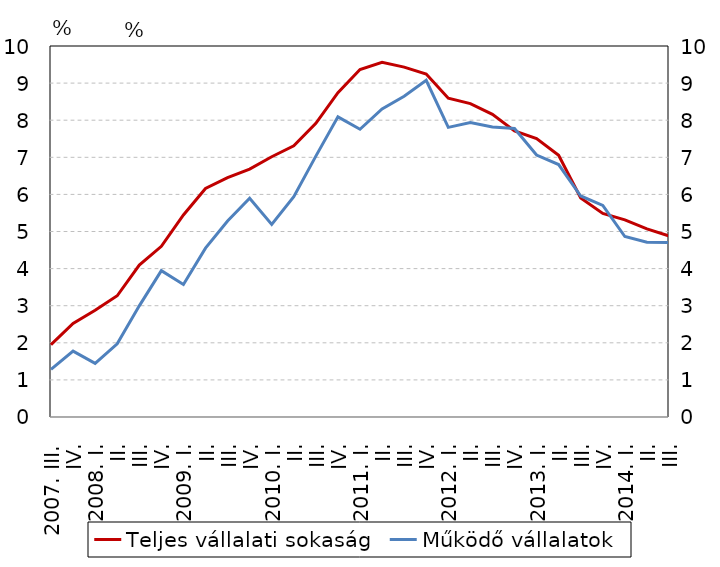
| Category | Teljes vállalati sokaság |
|---|---|
| 2007. III. | 1.948 |
| IV. | 2.521 |
| 2008. I. | 2.875 |
| II. | 3.268 |
| III. | 4.096 |
| IV. | 4.6 |
| 2009. I. | 5.446 |
| II. | 6.159 |
| III. | 6.451 |
| IV. | 6.683 |
| 2010. I. | 7.015 |
| II. | 7.312 |
| III. | 7.918 |
| IV. | 8.742 |
| 2011. I. | 9.366 |
| II. | 9.558 |
| III. | 9.43 |
| IV. | 9.246 |
| 2012. I. | 8.593 |
| II. | 8.446 |
| III. | 8.159 |
| IV. | 7.713 |
| 2013. I. | 7.503 |
| II. | 7.056 |
| III. | 5.906 |
| IV. | 5.486 |
| 2014. I. | 5.315 |
| II. | 5.072 |
| III. | 4.88 |